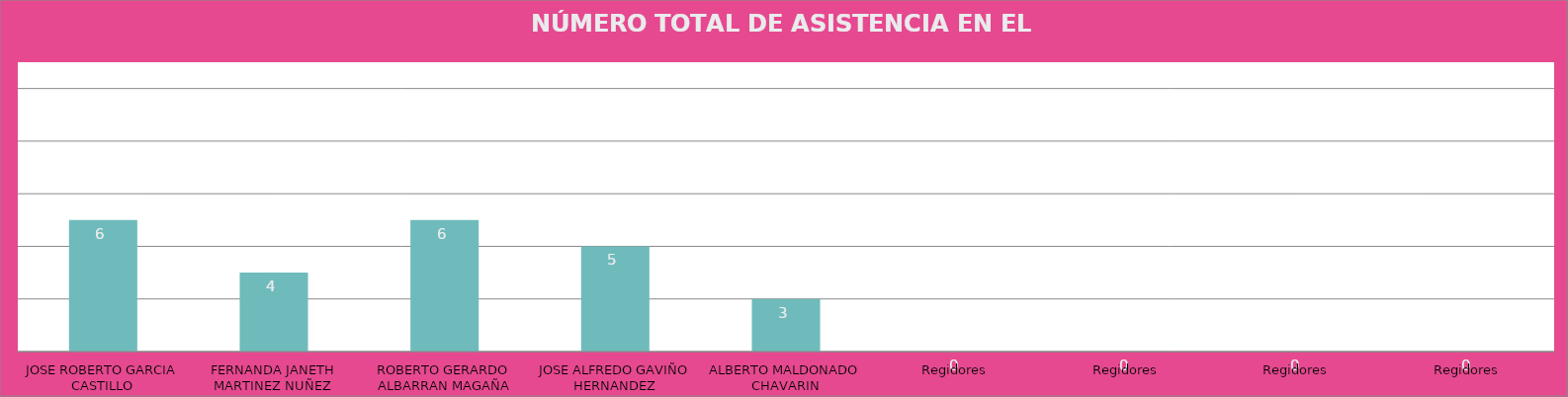
| Category | JOSE ROBERTO GARCIA CASTILLO FERNANDA JANETH MARTINEZ NUÑEZ ROBERTO GERARDO ALBARRAN MAGAÑA JOSE ALFREDO GAVIÑO HERNANDEZ ALBERTO MALDONADO CHAVARIN Regidores Regidores Regidores Regidores |
|---|---|
| JOSE ROBERTO GARCIA CASTILLO | 6 |
| FERNANDA JANETH MARTINEZ NUÑEZ | 4 |
| ROBERTO GERARDO ALBARRAN MAGAÑA | 6 |
| JOSE ALFREDO GAVIÑO HERNANDEZ | 5 |
| ALBERTO MALDONADO CHAVARIN | 3 |
| Regidores | 0 |
| Regidores | 0 |
| Regidores | 0 |
| Regidores | 0 |